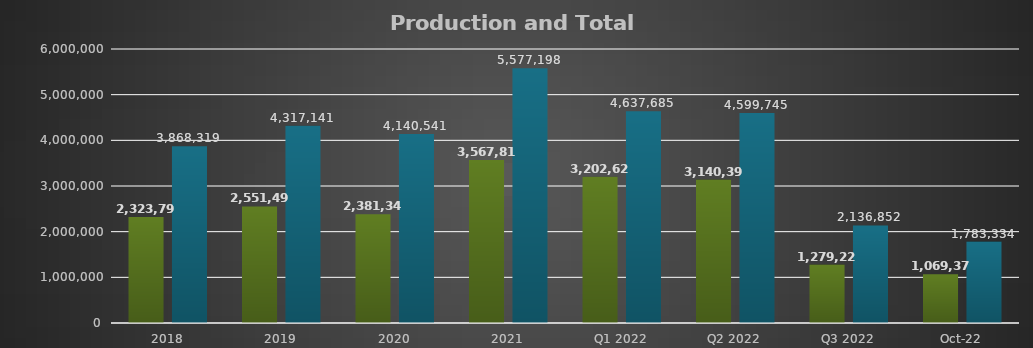
| Category | Production Ha | Total Ha* |
|---|---|---|
| 2018 | 2323798.97 | 3868318.93 |
| 2019 | 2551499 | 4317141 |
| 2020 | 2381340.48 | 4140541.15 |
| 2021 | 3567815 | 5577198 |
| Q1 2022 | 3202628 | 4637685 |
| Q2 2022 | 3140394 | 4599745 |
| Q3 2022 | 1279221.18 | 2136851.51 |
| Oct-22 | 1069379.46 | 1783334.14 |